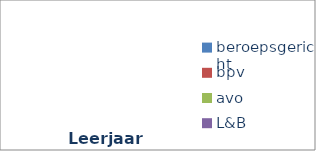
| Category | Series 0 |
|---|---|
| beroepsgericht | 0 |
| bpv | 0 |
| avo | 0 |
| L&B | 0 |